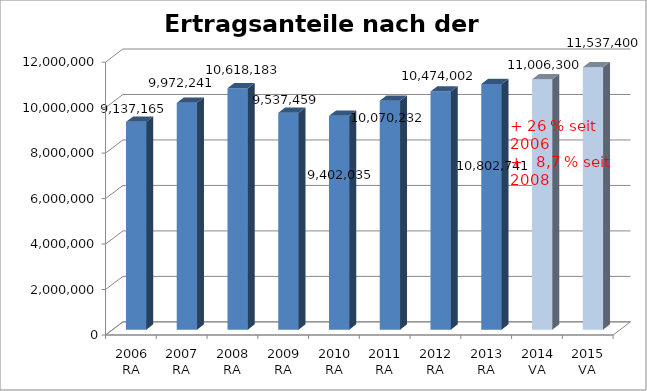
| Category | Ertragsanteile nach der Bevölkerung  |
|---|---|
| 2006 RA | 9137165 |
| 2007 RA | 9972241 |
| 2008 RA | 10618183 |
| 2009 RA | 9537459 |
| 2010 RA | 9402035 |
| 2011 RA | 10070232 |
| 2012 RA | 10474002 |
| 2013 RA | 10802741 |
| 2014 VA | 11006300 |
| 2015 VA | 11537400 |